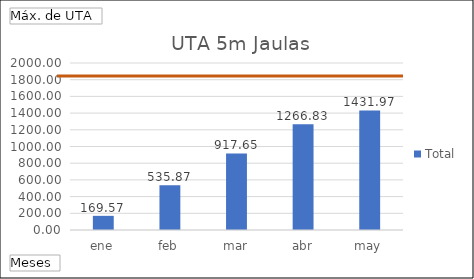
| Category | Total |
|---|---|
| ene | 169.57 |
| feb | 535.865 |
| mar | 917.653 |
| abr | 1266.832 |
| may | 1431.969 |